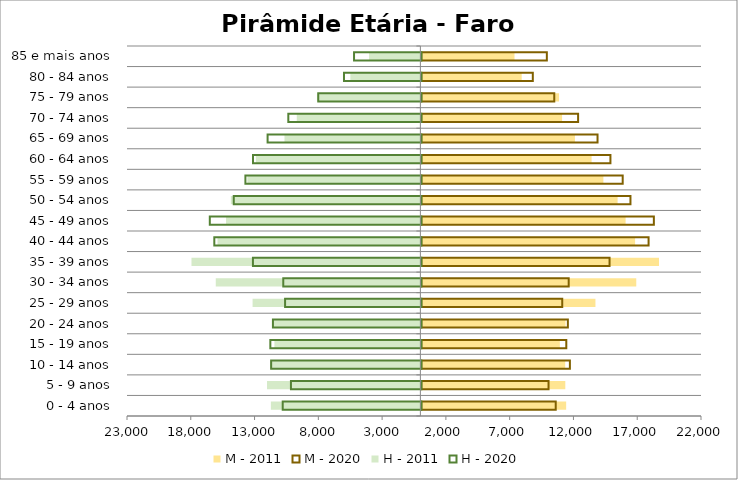
| Category | M - 2011 | M - 2020 | H - 2011 | H - 2020 |
|---|---|---|---|---|
| 0 - 4 anos | 11351 | 10532 | -11720 | -10871 |
| 5 - 9 anos | 11284 | 9969 | -12023 | -10226 |
| 10 - 14 anos | 11276 | 11643 | -11786 | -11778 |
| 15 - 19 anos | 10857 | 11361 | -11443 | -11841 |
| 20 - 24 anos | 11301 | 11484 | -11619 | -11638 |
| 25 - 29 anos | 13647 | 11043 | -13154 | -10685 |
| 30 - 34 anos | 16847 | 11549 | -16041 | -10827 |
| 35 - 39 anos | 18629 | 14752 | -17945 | -13206 |
| 40 - 44 anos | 16756 | 17812 | -15904 | -16234 |
| 45 - 49 anos | 16011 | 18226 | -15235 | -16587 |
| 50 - 54 anos | 15384 | 16391 | -14859 | -14709 |
| 55 - 59 anos | 14269 | 15783 | -13564 | -13796 |
| 60 - 64 anos | 13345 | 14821 | -12898 | -13200 |
| 65 - 69 anos | 12040 | 13810 | -10654 | -12056 |
| 70 - 74 anos | 11032 | 12287 | -9690 | -10432 |
| 75 - 79 anos | 10794 | 10418 | -8107 | -8085 |
| 80 - 84 anos | 7865 | 8736 | -5488 | -6067 |
| 85 e mais anos | 7302 | 9836 | -4020 | -5279 |